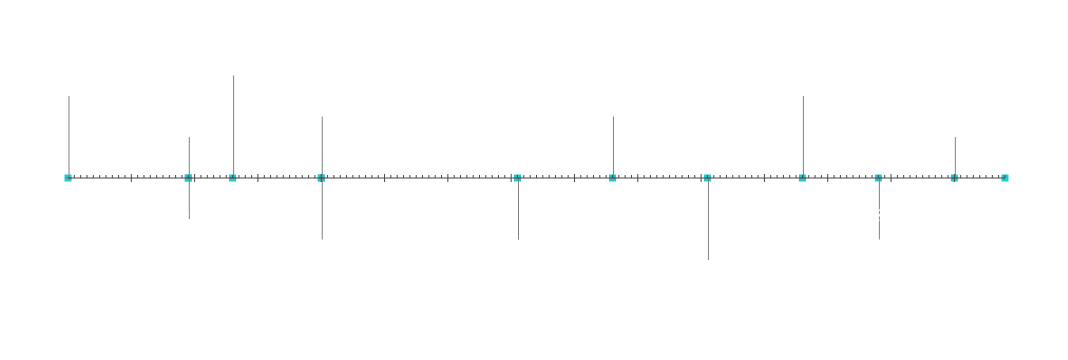
| Category | Positsioon |
|---|---|
| Projekti algus | 20 |
| Vaheetapp 1 | 10 |
| Vaheetapp 2 | -10 |
| Vaheetapp 3 | 25 |
| Vaheetapp 4 | -15 |
| Vaheetapp 5 | 15 |
| Vaheetapp 6 | -15 |
| Vaheetapp 7 | 15 |
| Vaheetapp 8 | -20 |
| Vaheetapp 9 | 20 |
| Vaheetapp 10 | -15 |
| Vaheetapp 11 | 10 |
| Projekti lõpp | 5 |